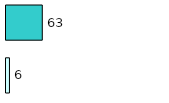
| Category | Series 0 | Series 1 |
|---|---|---|
| 0 | 6 | 63 |